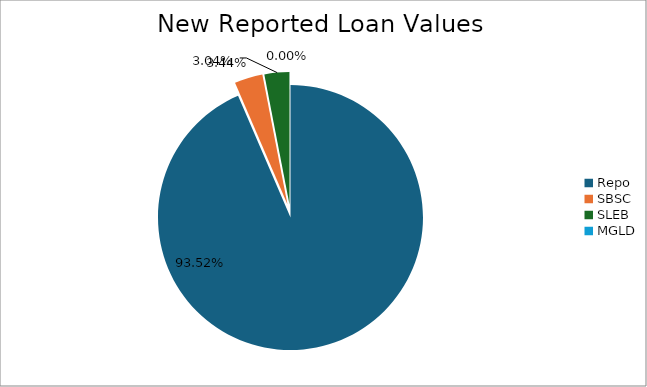
| Category | Series 0 |
|---|---|
| Repo | 11630213.783 |
| SBSC | 427422.416 |
| SLEB | 377618.69 |
| MGLD | 492.741 |